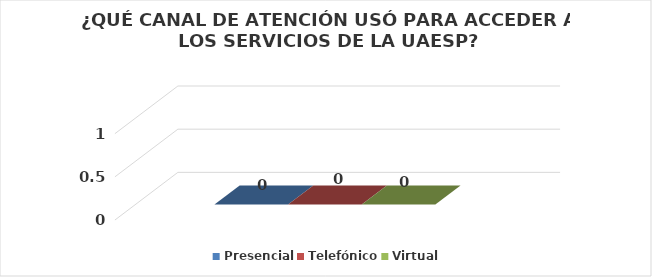
| Category | Presencial | Telefónico | Virtual |
|---|---|---|---|
| 0 | 0 | 0 | 0 |